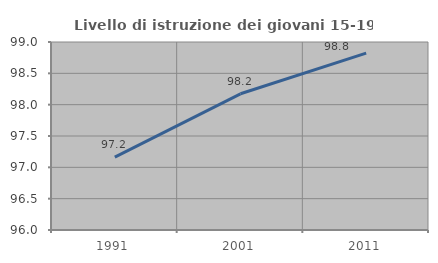
| Category | Livello di istruzione dei giovani 15-19 anni |
|---|---|
| 1991.0 | 97.164 |
| 2001.0 | 98.174 |
| 2011.0 | 98.824 |